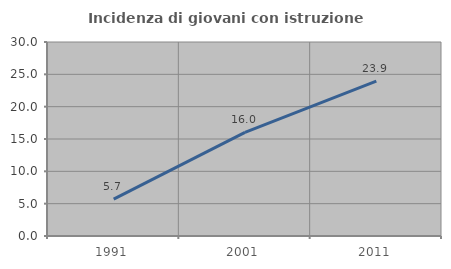
| Category | Incidenza di giovani con istruzione universitaria |
|---|---|
| 1991.0 | 5.702 |
| 2001.0 | 16.034 |
| 2011.0 | 23.936 |